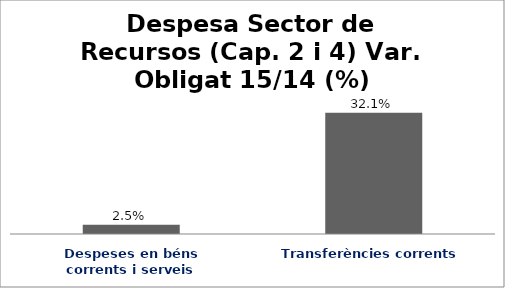
| Category | Series 0 |
|---|---|
| Despeses en béns corrents i serveis | 0.025 |
| Transferències corrents | 0.321 |